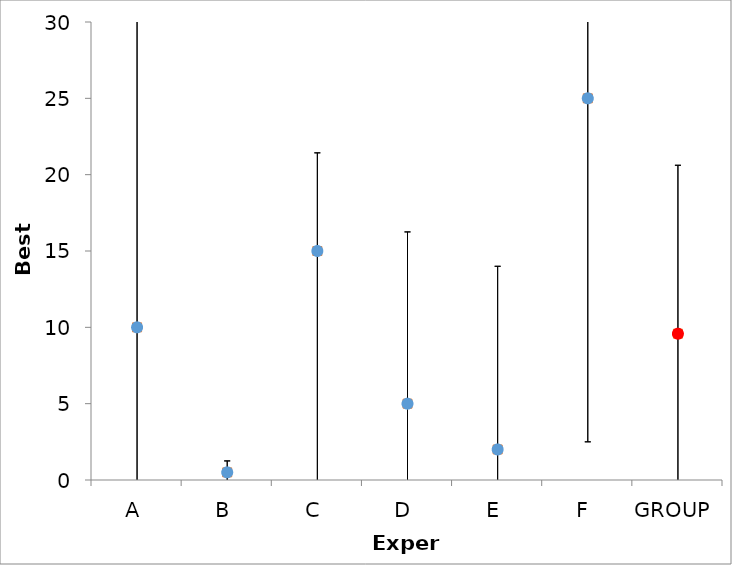
| Category | Series 1 | Series 0 |
|---|---|---|
| A | 10 | 10 |
| B | 0.5 | 0.5 |
| C | 15 | 15 |
| D | 5 | 5 |
| E | 2 | 2 |
| F | 25 | 25 |
| GROUP | 9.583 | 9.583 |